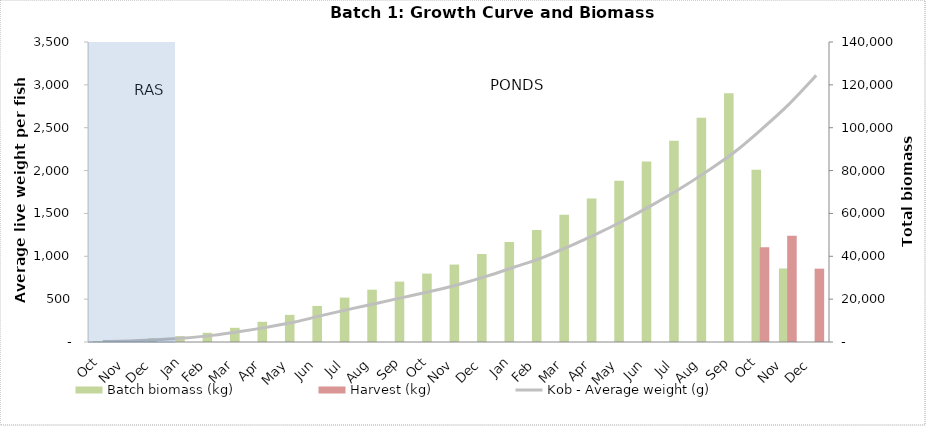
| Category | Batch biomass (kg) | Harvest (kg) |
|---|---|---|
| Apr | 353.244 | 0 |
| May | 749.558 | 0 |
| Jun | 1671.569 | 0 |
| Jul | 2751.846 | 0 |
| Aug | 4299.882 | 0 |
| Sep | 6620.728 | 0 |
| Oct | 9435.734 | 0 |
| Nov | 12657.147 | 0 |
| Dec | 16817.175 | 0 |
| Jan | 20712.411 | 0 |
| Feb | 24426.795 | 0 |
| Mar | 28194.461 | 0 |
| Apr | 31923.622 | 0 |
| May | 36136.536 | 0 |
| Jun | 41077.531 | 0 |
| Jul | 46695.096 | 0 |
| Aug | 52322.287 | 0 |
| Sep | 59359.445 | 0 |